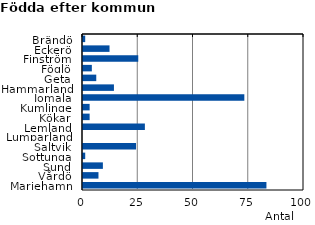
| Category | Series 0 |
|---|---|
| Brändö | 1 |
| Eckerö | 12 |
| Finström | 25 |
| Föglö | 4 |
| Geta | 6 |
| Hammarland | 14 |
| Jomala | 73 |
| Kumlinge | 3 |
| Kökar | 3 |
| Lemland | 28 |
| Lumparland | 0 |
| Saltvik | 24 |
| Sottunga | 1 |
| Sund | 9 |
| Vårdö | 7 |
| Mariehamn | 83 |